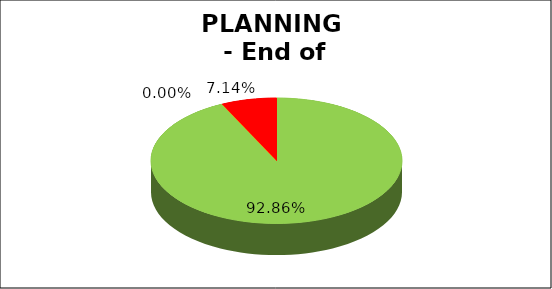
| Category | Series 0 |
|---|---|
| Green | 0.929 |
| Amber | 0 |
| Red | 0.071 |